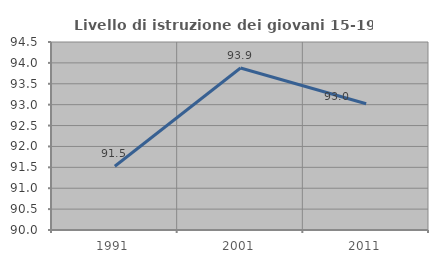
| Category | Livello di istruzione dei giovani 15-19 anni |
|---|---|
| 1991.0 | 91.525 |
| 2001.0 | 93.878 |
| 2011.0 | 93.023 |